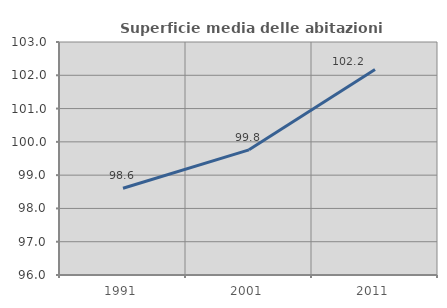
| Category | Superficie media delle abitazioni occupate |
|---|---|
| 1991.0 | 98.608 |
| 2001.0 | 99.76 |
| 2011.0 | 102.171 |